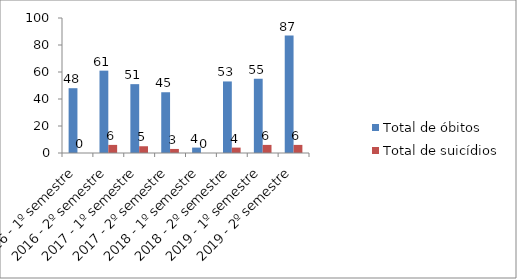
| Category | Total de óbitos | Total de suicídios |
|---|---|---|
| 2016 - 1º semestre | 48 | 0 |
| 2016 - 2º semestre | 61 | 6 |
| 2017 - 1º semestre | 51 | 5 |
| 2017 - 2º semestre | 45 | 3 |
| 2018 - 1º semestre | 4 | 0 |
| 2018 - 2º semestre | 53 | 4 |
| 2019 - 1º semestre | 55 | 6 |
| 2019 - 2º semestre | 87 | 6 |